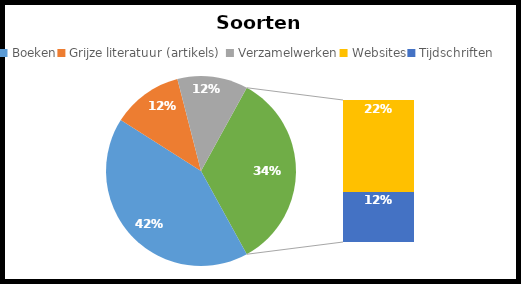
| Category | Series 0 |
|---|---|
| Boeken | 21 |
| Grijze literatuur (artikels)  | 6 |
| Verzamelwerken | 6 |
| Websites | 11 |
| Tijdschriften | 6 |